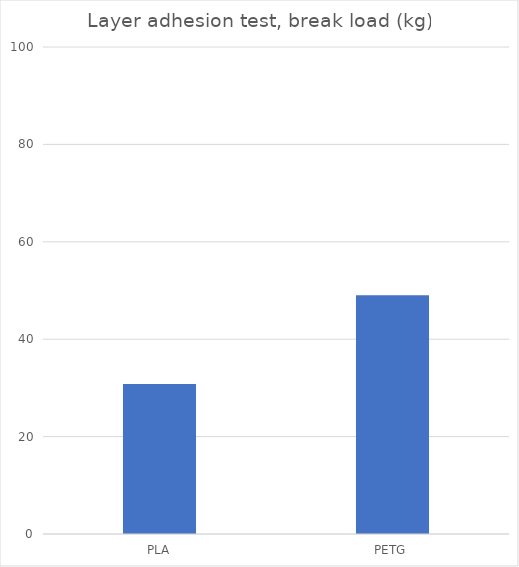
| Category | Average |
|---|---|
| PLA | 30.8 |
| PETG | 49 |